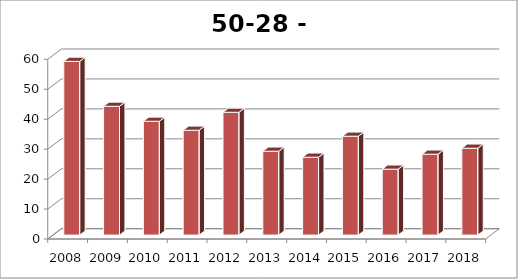
| Category | Biest-Houtakker |
|---|---|
| 2008.0 | 58 |
| 2009.0 | 43 |
| 2010.0 | 38 |
| 2011.0 | 35 |
| 2012.0 | 41 |
| 2013.0 | 28 |
| 2014.0 | 26 |
| 2015.0 | 33 |
| 2016.0 | 22 |
| 2017.0 | 27 |
| 2018.0 | 29 |